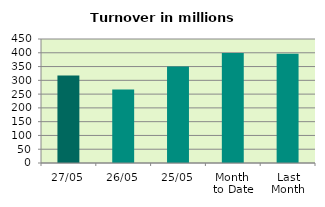
| Category | Series 0 |
|---|---|
| 27/05 | 317.721 |
| 26/05 | 266.44 |
| 25/05 | 350.244 |
| Month 
to Date | 399.341 |
| Last
Month | 396.429 |